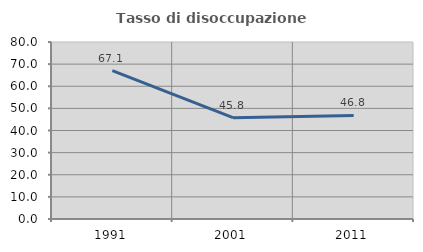
| Category | Tasso di disoccupazione giovanile  |
|---|---|
| 1991.0 | 67.084 |
| 2001.0 | 45.785 |
| 2011.0 | 46.816 |